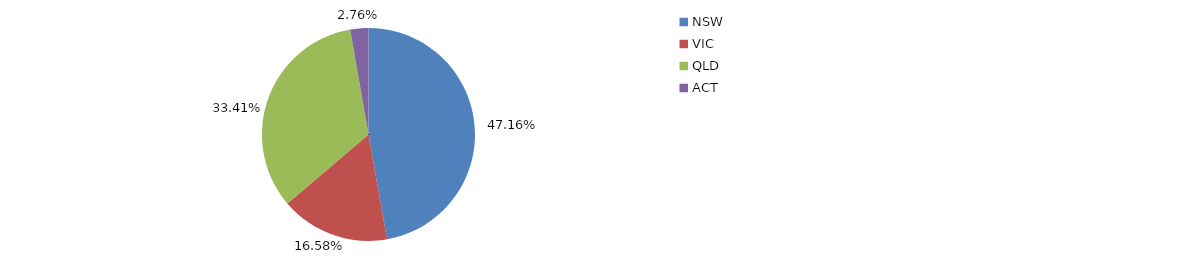
| Category | Series 0 |
|---|---|
| NSW | 0.472 |
| VIC | 0.166 |
| QLD | 0.334 |
| ACT | 0.028 |